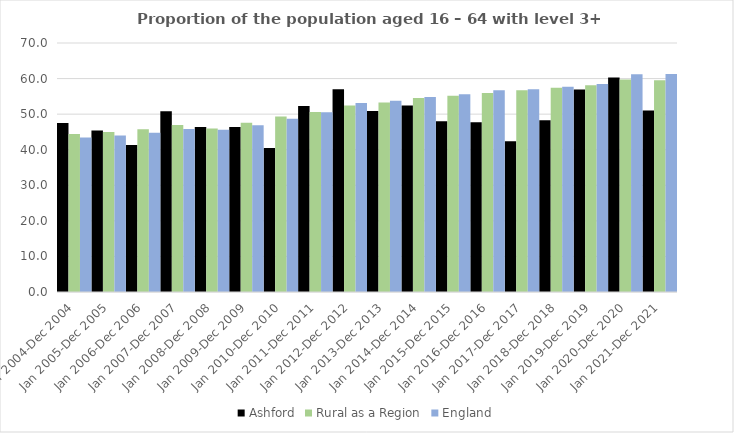
| Category | Ashford | Rural as a Region | England |
|---|---|---|---|
| Jan 2004-Dec 2004 | 47.5 | 44.405 | 43.4 |
| Jan 2005-Dec 2005 | 45.4 | 44.973 | 44 |
| Jan 2006-Dec 2006 | 41.3 | 45.774 | 44.8 |
| Jan 2007-Dec 2007 | 50.8 | 46.968 | 45.8 |
| Jan 2008-Dec 2008 | 46.4 | 45.964 | 45.6 |
| Jan 2009-Dec 2009 | 46.4 | 47.59 | 46.9 |
| Jan 2010-Dec 2010 | 40.5 | 49.362 | 48.7 |
| Jan 2011-Dec 2011 | 52.3 | 50.602 | 50.5 |
| Jan 2012-Dec 2012 | 57 | 52.439 | 53.1 |
| Jan 2013-Dec 2013 | 50.9 | 53.276 | 53.8 |
| Jan 2014-Dec 2014 | 52.4 | 54.57 | 54.8 |
| Jan 2015-Dec 2015 | 48 | 55.16 | 55.6 |
| Jan 2016-Dec 2016 | 47.7 | 55.941 | 56.7 |
| Jan 2017-Dec 2017 | 42.4 | 56.689 | 57 |
| Jan 2018-Dec 2018 | 48.3 | 57.389 | 57.7 |
| Jan 2019-Dec 2019 | 56.9 | 58.147 | 58.5 |
| Jan 2020-Dec 2020 | 60.3 | 59.771 | 61.2 |
| Jan 2021-Dec 2021 | 51 | 59.54 | 61.3 |